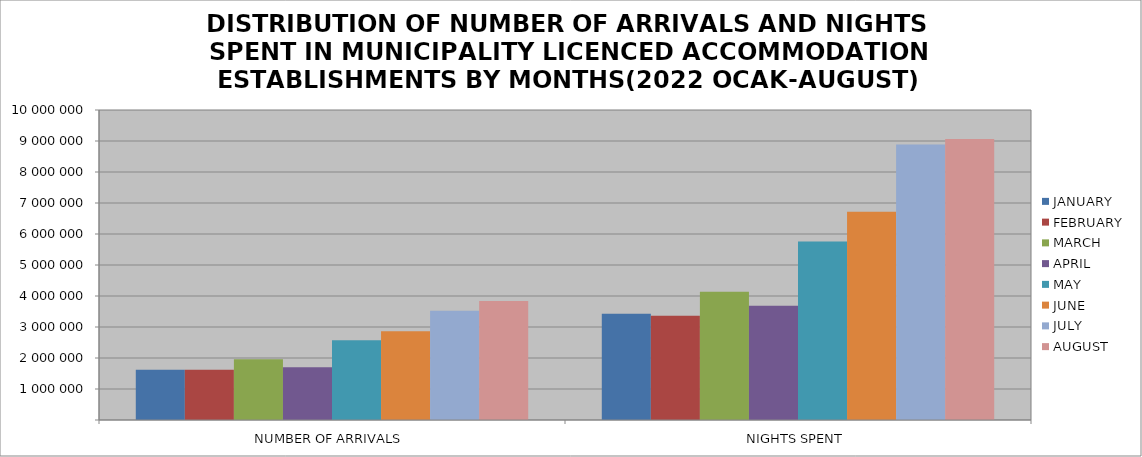
| Category | JANUARY | FEBRUARY | MARCH | APRIL | MAY | JUNE | JULY | AUGUST |
|---|---|---|---|---|---|---|---|---|
| NUMBER OF ARRIVALS | 1617436 | 1619305 | 1960867 | 1699422 | 2574819 | 2859746 | 3526528 | 3842457 |
| NIGHTS SPENT | 3427709 | 3362025 | 4136510 | 3684991 | 5758959 | 6716122 | 8890725 | 9063514 |